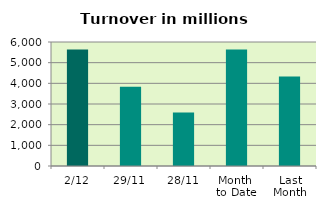
| Category | Series 0 |
|---|---|
| 2/12 | 5637.772 |
| 29/11 | 3839.534 |
| 28/11 | 2587.541 |
| Month 
to Date | 5637.772 |
| Last
Month | 4332.538 |